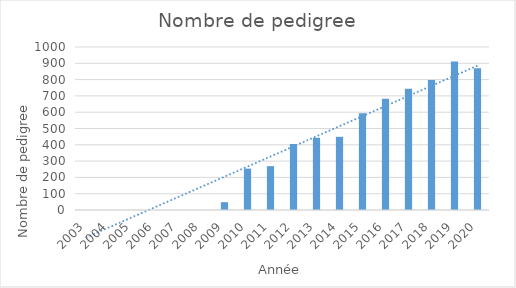
| Category | Series 0 |
|---|---|
| 2003.0 | 0 |
| 2004.0 | 0 |
| 2005.0 | 0 |
| 2006.0 | 0 |
| 2007.0 | 0 |
| 2008.0 | 0 |
| 2009.0 | 48 |
| 2010.0 | 254 |
| 2011.0 | 269 |
| 2012.0 | 405 |
| 2013.0 | 443 |
| 2014.0 | 449 |
| 2015.0 | 594 |
| 2016.0 | 682 |
| 2017.0 | 744 |
| 2018.0 | 798 |
| 2019.0 | 911 |
| 2020.0 | 870 |